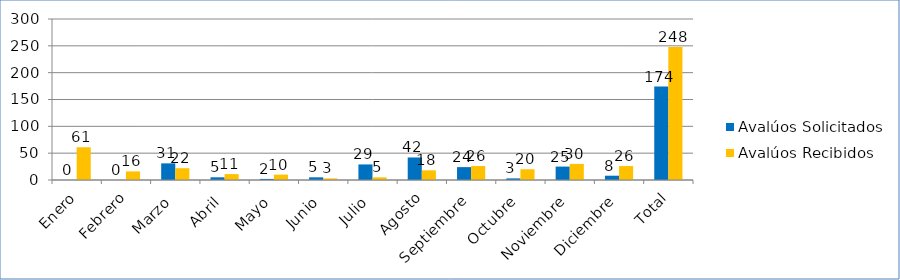
| Category | Avalúos Solicitados | Avalúos Recibidos |
|---|---|---|
| Enero | 0 | 61 |
| Febrero | 0 | 16 |
| Marzo | 31 | 22 |
| Abril | 5 | 11 |
| Mayo | 2 | 10 |
| Junio | 5 | 3 |
| Julio | 29 | 5 |
| Agosto | 42 | 18 |
| Septiembre | 24 | 26 |
| Octubre | 3 | 20 |
| Noviembre | 25 | 30 |
| Diciembre | 8 | 26 |
| Total | 174 | 248 |